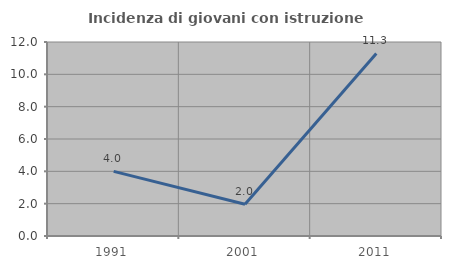
| Category | Incidenza di giovani con istruzione universitaria |
|---|---|
| 1991.0 | 4 |
| 2001.0 | 1.961 |
| 2011.0 | 11.29 |